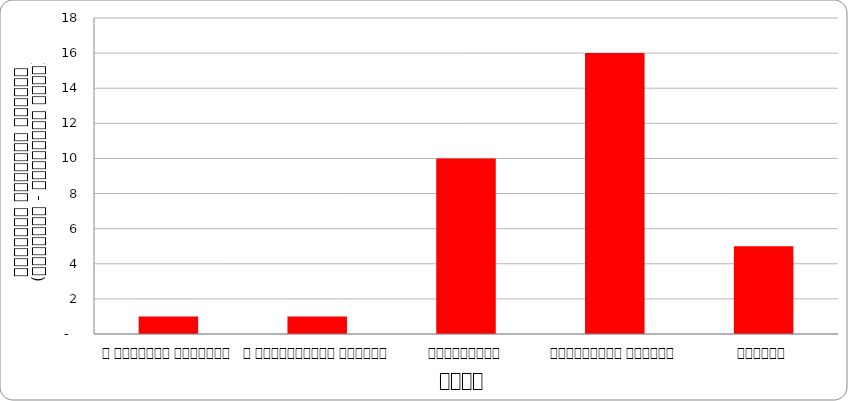
| Category | समाज |
|---|---|
| द हिमालयन टाइम्स् | 1 |
| द काठमाण्डौं पोस्ट् | 1 |
| कान्तिपुर | 10 |
| अन्नपूर्ण पोस्ट् | 16 |
| नागरिक | 5 |